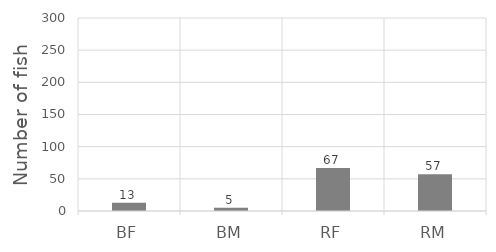
| Category | Series 0 |
|---|---|
| BF | 13 |
| BM | 5 |
| RF | 67 |
| RM | 57 |